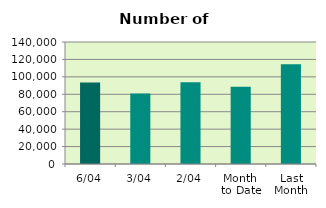
| Category | Series 0 |
|---|---|
| 6/04 | 93620 |
| 3/04 | 80764 |
| 2/04 | 93824 |
| Month 
to Date | 88538.5 |
| Last
Month | 114377.455 |